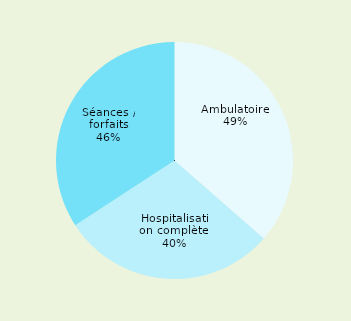
| Category | Series 0 |
|---|---|
| Ambulatoire  | 0.492 |
| Hospitalisation complète  | 0.397 |
| Séances / forfaits | 0.462 |